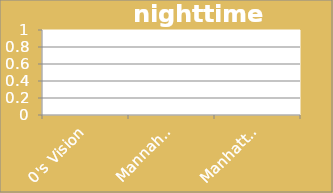
| Category | nighttime density |
|---|---|
| 0's Vision | 0 |
| Mannahatta (1609) | 0 |
| Manhattan (2010) | 0 |